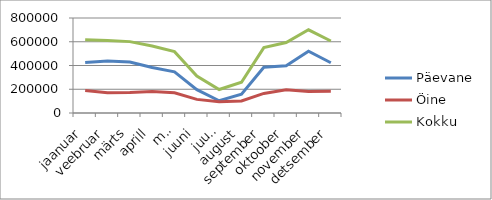
| Category | Päevane | Öine | Kokku |
|---|---|---|---|
| jaanuar | 425795.1 | 190227.8 | 616022.9 |
| veebruar | 438557 | 171046.4 | 609603.4 |
| märts | 428803.1 | 172294.4 | 601097.5 |
| aprill | 382652.2 | 180997.1 | 563649.3 |
| mai | 346800.2 | 169711 | 516511.2 |
| juuni | 196842.7 | 114615.1 | 311457.8 |
| juuli | 103150.856 | 94526.758 | 197677.614 |
| august | 157430.088 | 101419.296 | 258849.384 |
| september | 385798.178 | 165069.405 | 550867.583 |
| oktoober | 398316.783 | 195482.588 | 593799.371 |
| november | 519991.151 | 180768.424 | 700759.575 |
| detsember | 423358.099 | 183144.023 | 606502.122 |